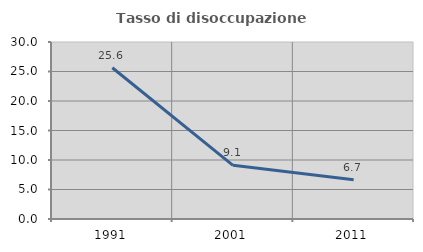
| Category | Tasso di disoccupazione giovanile  |
|---|---|
| 1991.0 | 25.641 |
| 2001.0 | 9.091 |
| 2011.0 | 6.667 |